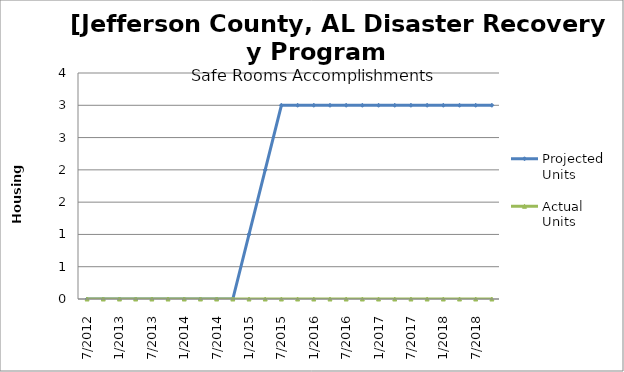
| Category | Projected Units | Actual Units |
|---|---|---|
| 7/2012 | 0 | 0 |
| 10/2012 | 0 | 0 |
| 1/2013 | 0 | 0 |
| 4/2013 | 0 | 0 |
| 7/2013 | 0 | 0 |
| 10/2013 | 0 | 0 |
| 1/2014 | 0 | 0 |
| 4/2014 | 0 | 0 |
| 7/2014 | 0 | 0 |
| 10/2014 | 0 | 0 |
| 1/2015 | 1 | 0 |
| 4/2015 | 2 | 0 |
| 7/2015 | 3 | 0 |
| 10/2015 | 3 | 0 |
| 1/2016 | 3 | 0 |
| 4/2016 | 3 | 0 |
| 7/2016 | 3 | 0 |
| 10/2016 | 3 | 0 |
| 1/2017 | 3 | 0 |
| 4/2017 | 3 | 0 |
| 7/2017 | 3 | 0 |
| 10/2017 | 3 | 0 |
| 1/2018 | 3 | 0 |
| 4/2018 | 3 | 0 |
| 7/2018 | 3 | 0 |
| 10/2018 | 3 | 0 |